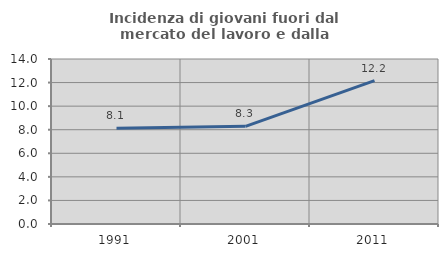
| Category | Incidenza di giovani fuori dal mercato del lavoro e dalla formazione  |
|---|---|
| 1991.0 | 8.122 |
| 2001.0 | 8.287 |
| 2011.0 | 12.162 |